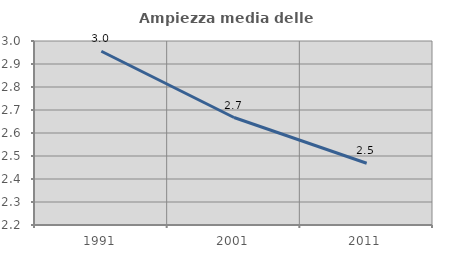
| Category | Ampiezza media delle famiglie |
|---|---|
| 1991.0 | 2.955 |
| 2001.0 | 2.667 |
| 2011.0 | 2.469 |